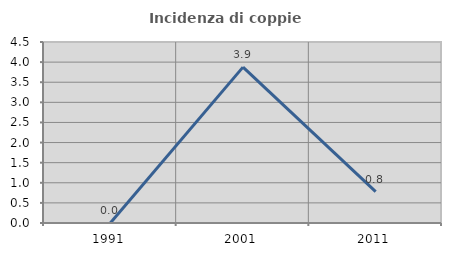
| Category | Incidenza di coppie miste |
|---|---|
| 1991.0 | 0 |
| 2001.0 | 3.876 |
| 2011.0 | 0.781 |